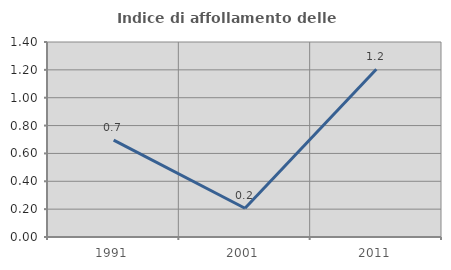
| Category | Indice di affollamento delle abitazioni  |
|---|---|
| 1991.0 | 0.695 |
| 2001.0 | 0.206 |
| 2011.0 | 1.205 |